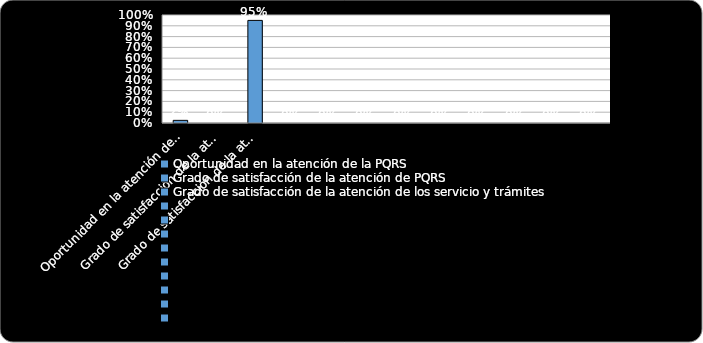
| Category | % Cumplimiento  |
|---|---|
| Oportunidad en la atención de la PQRS  | 0.025 |
| Grado de satisfacción de la atención de PQRS  | 0 |
| Grado de satisfacción de la atención de los servicio y trámites | 0.95 |